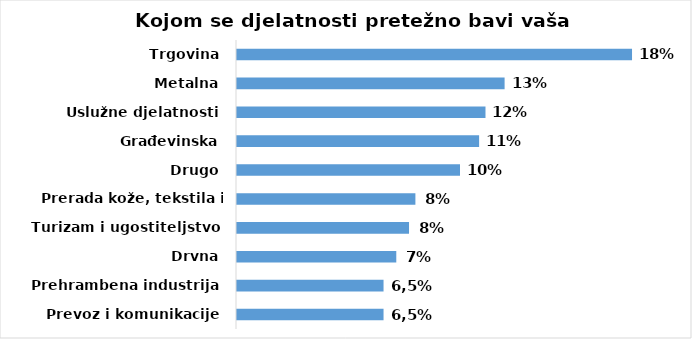
| Category | Series 0 |
|---|---|
| Prevoz i komunikacije | 23 |
| Prehrambena industrija | 23 |
| Drvna | 25 |
| Turizam i ugostiteljstvo | 27 |
| Prerada kože, tekstila i obuće | 28 |
| Drugo | 35 |
| Građevinska | 38 |
| Uslužne djelatnosti | 39 |
| Metalna | 42 |
| Trgovina | 62 |